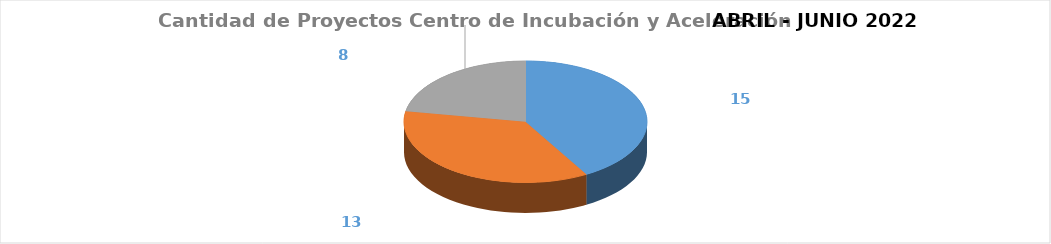
| Category | Series 0 |
|---|---|
| Proyectos Pre-Incubados | 15 |
| Proyectos Incubados | 13 |
| Proyectos en Aceleración | 8 |